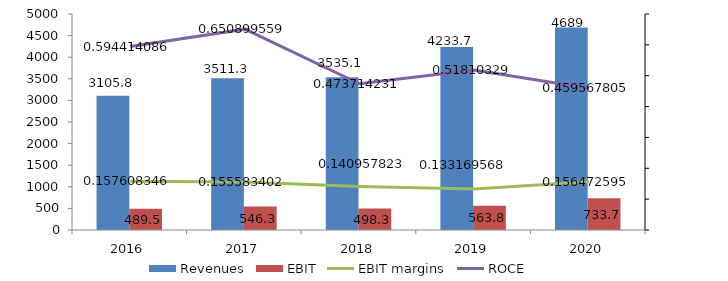
| Category | Revenues | EBIT |
|---|---|---|
| 2016.0 | 3105.8 | 489.5 |
| 2017.0 | 3511.3 | 546.3 |
| 2018.0 | 3535.1 | 498.3 |
| 2019.0 | 4233.7 | 563.8 |
| 2020.0 | 4689 | 733.7 |